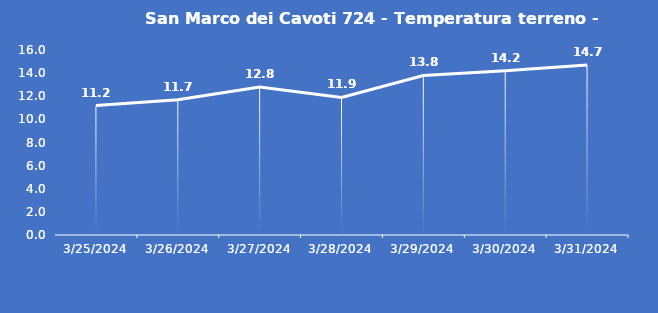
| Category | San Marco dei Cavoti 724 - Temperatura terreno - Grezzo (°C) |
|---|---|
| 3/25/24 | 11.2 |
| 3/26/24 | 11.7 |
| 3/27/24 | 12.8 |
| 3/28/24 | 11.9 |
| 3/29/24 | 13.8 |
| 3/30/24 | 14.2 |
| 3/31/24 | 14.7 |